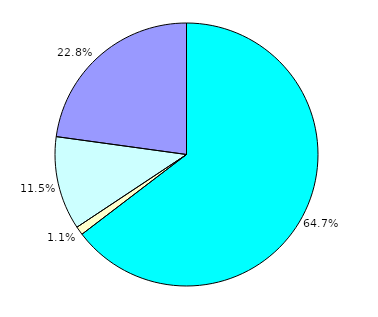
| Category | 34 410 |
|---|---|
| 0 | 34410 |
| 1 | 557 |
| 2 | 6122 |
| 3 | 12154 |